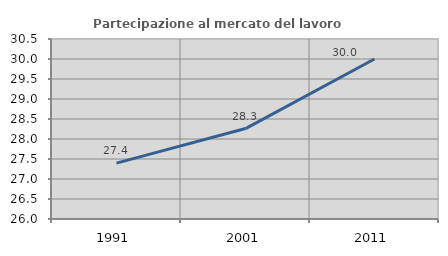
| Category | Partecipazione al mercato del lavoro  femminile |
|---|---|
| 1991.0 | 27.397 |
| 2001.0 | 28.261 |
| 2011.0 | 30 |